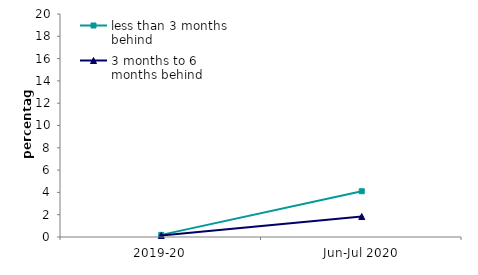
| Category | less than 3 months behind | 3 months to 6 months behind |
|---|---|---|
| 2019-20 | 0.191 | 0.139 |
| Jun-Jul 2020 | 4.104 | 1.836 |